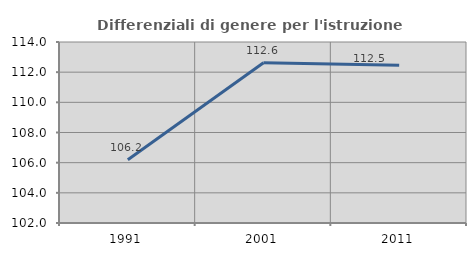
| Category | Differenziali di genere per l'istruzione superiore |
|---|---|
| 1991.0 | 106.197 |
| 2001.0 | 112.622 |
| 2011.0 | 112.463 |